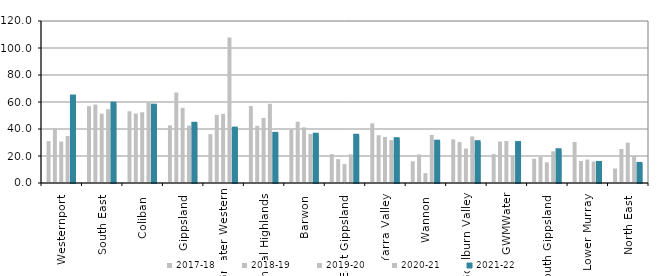
| Category | 2017-18 | 2018-19 | 2019-20 | 2020-21 | 2021-22 |
|---|---|---|---|---|---|
| Westernport  | 31 | 40.431 | 30.692 | 34.75 | 64.057 |
| South East  | 56.97 | 58.111 | 51.381 | 54.66 | 58.8 |
| Coliban  | 53.132 | 51.449 | 52.411 | 59.75 | 57.27 |
| Gippsland  | 42.684 | 67 | 55.667 | 42.5 | 43.875 |
| Greater Western | 36.171 | 50.474 | 51.225 | 107.698 | 40.291 |
| Central Highlands  | 57.009 | 42.37 | 48.203 | 58.673 | 36.397 |
| Barwon  | 39.602 | 45.361 | 41.185 | 36.35 | 35.758 |
| East Gippsland  | 21.4 | 17.667 | 14 | 21.25 | 35 |
| Yarra Valley  | 44.182 | 35.404 | 34.101 | 31.751 | 32.463 |
| Wannon  | 16.063 | 21.149 | 7.35 | 35.586 | 30.583 |
| Goulburn Valley  | 32.328 | 30.345 | 25.554 | 34.5 | 30.247 |
| GWMWater | 21.388 | 30.717 | 31.143 | 20.605 | 29.6 |
| South Gippsland  | 17.971 | 19.286 | 15.353 | 23.45 | 24.267 |
| Lower Murray  | 30.442 | 16.318 | 17.391 | 15.938 | 14.847 |
| North East  | 10.75 | 25.222 | 29.9 | 20 | 14.154 |